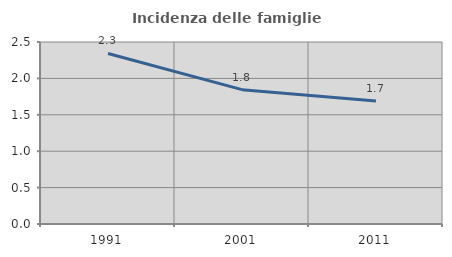
| Category | Incidenza delle famiglie numerose |
|---|---|
| 1991.0 | 2.343 |
| 2001.0 | 1.845 |
| 2011.0 | 1.689 |